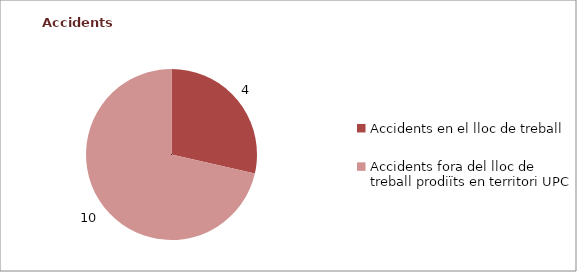
| Category | Series 0 |
|---|---|
| Accidents en el lloc de treball | 4 |
| Accidents fora del lloc de treball prodiïts en territori UPC | 10 |